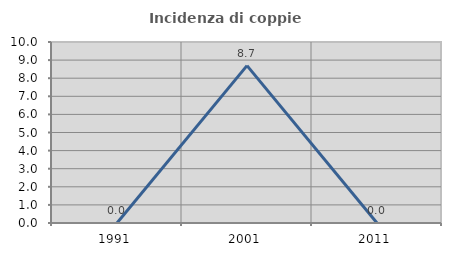
| Category | Incidenza di coppie miste |
|---|---|
| 1991.0 | 0 |
| 2001.0 | 8.696 |
| 2011.0 | 0 |